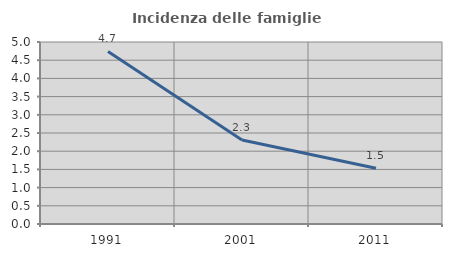
| Category | Incidenza delle famiglie numerose |
|---|---|
| 1991.0 | 4.741 |
| 2001.0 | 2.31 |
| 2011.0 | 1.53 |